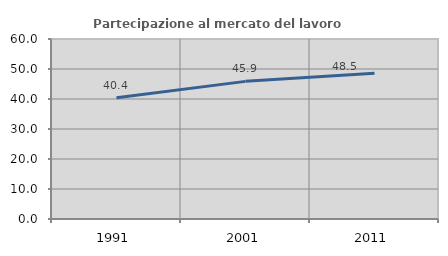
| Category | Partecipazione al mercato del lavoro  femminile |
|---|---|
| 1991.0 | 40.442 |
| 2001.0 | 45.877 |
| 2011.0 | 48.545 |